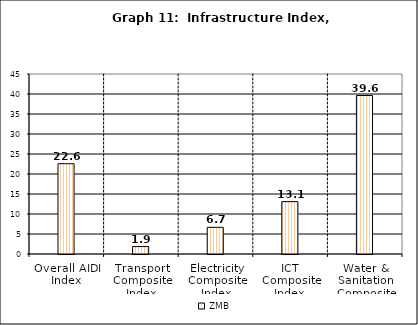
| Category | Series 0 | ZMB | Series 2 |
|---|---|---|---|
| Overall AIDI Index |  | 22.572 |  |
| Transport Composite Index |  | 1.859 |  |
| Electricity Composite Index |  | 6.667 |  |
| ICT Composite Index  |  | 13.092 |  |
| Water & Sanitation Composite Index |  | 39.617 |  |